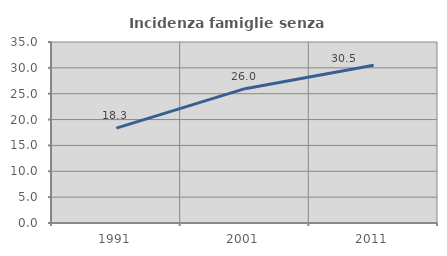
| Category | Incidenza famiglie senza nuclei |
|---|---|
| 1991.0 | 18.346 |
| 2001.0 | 25.974 |
| 2011.0 | 30.515 |